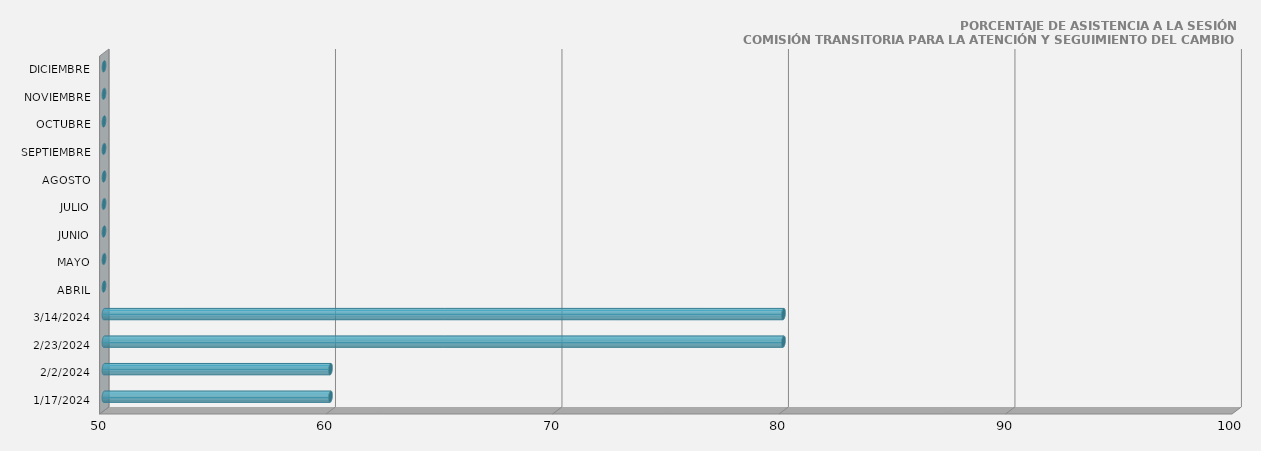
| Category | 17/01/2024 |
|---|---|
| 17/01/2024 | 60 |
| 02/02/2024 | 60 |
| 23/02/2024 | 80 |
| 14/03/2024 | 80 |
| ABRIL | 0 |
| MAYO | 0 |
| JUNIO | 0 |
| JULIO | 0 |
| AGOSTO | 0 |
| SEPTIEMBRE | 0 |
| OCTUBRE | 0 |
| NOVIEMBRE | 0 |
| DICIEMBRE | 0 |